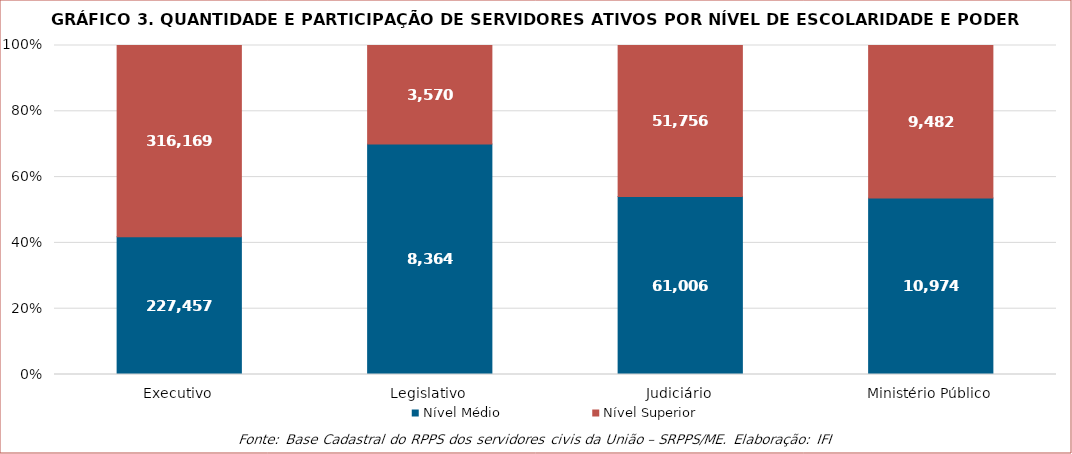
| Category | Nível Médio | Nível Superior |
|---|---|---|
| Executivo | 227457 | 316169 |
| Legislativo | 8364 | 3570 |
| Judiciário | 61006 | 51756 |
| Ministério Público | 10974 | 9482 |